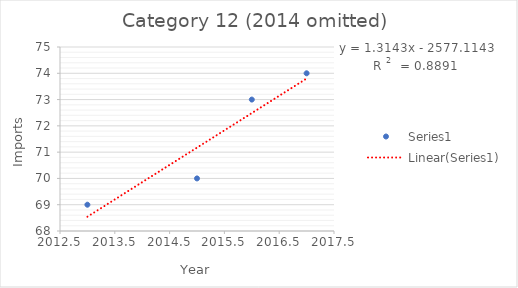
| Category | Series 0 |
|---|---|
| 2013.0 | 69 |
| 2015.0 | 70 |
| 2016.0 | 73 |
| 2017.0 | 74 |